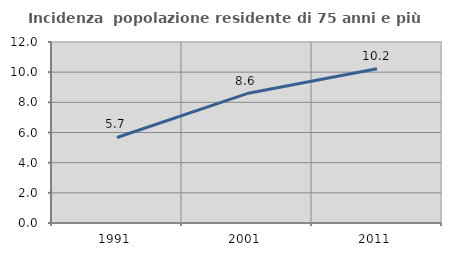
| Category | Incidenza  popolazione residente di 75 anni e più |
|---|---|
| 1991.0 | 5.67 |
| 2001.0 | 8.581 |
| 2011.0 | 10.227 |